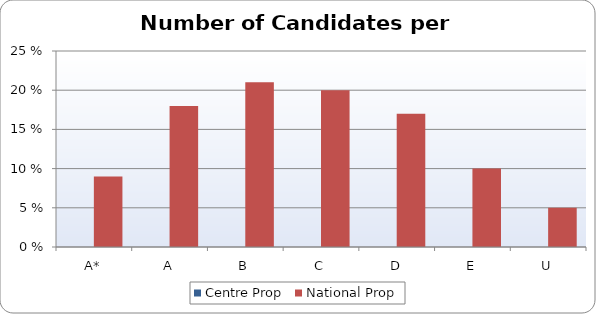
| Category | Centre Prop | National Prop |
|---|---|---|
| A* | 0 | 9 |
| A | 0 | 18 |
| B | 0 | 21 |
| C | 0 | 20 |
| D | 0 | 17 |
| E | 0 | 10 |
| U | 0 | 5 |